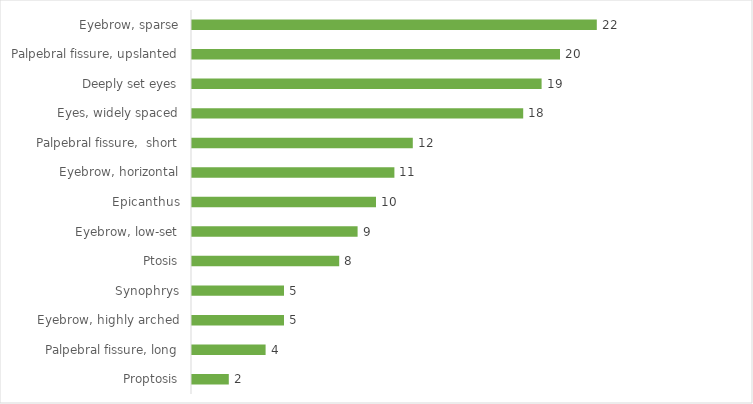
| Category | Series 0 |
|---|---|
| Proptosis | 2 |
| Palpebral fissure, long | 4 |
| Eyebrow, highly arched | 5 |
| Synophrys | 5 |
| Ptosis | 8 |
| Eyebrow, low-set | 9 |
| Epicanthus | 10 |
| Eyebrow, horizontal | 11 |
| Palpebral fissure,  short | 12 |
| Eyes, widely spaced | 18 |
| Deeply set eyes | 19 |
| Palpebral fissure, upslanted | 20 |
| Eyebrow, sparse | 22 |